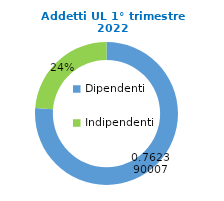
| Category | Series 0 |
|---|---|
| Dipendenti | 61948 |
| Indipendenti | 19307 |